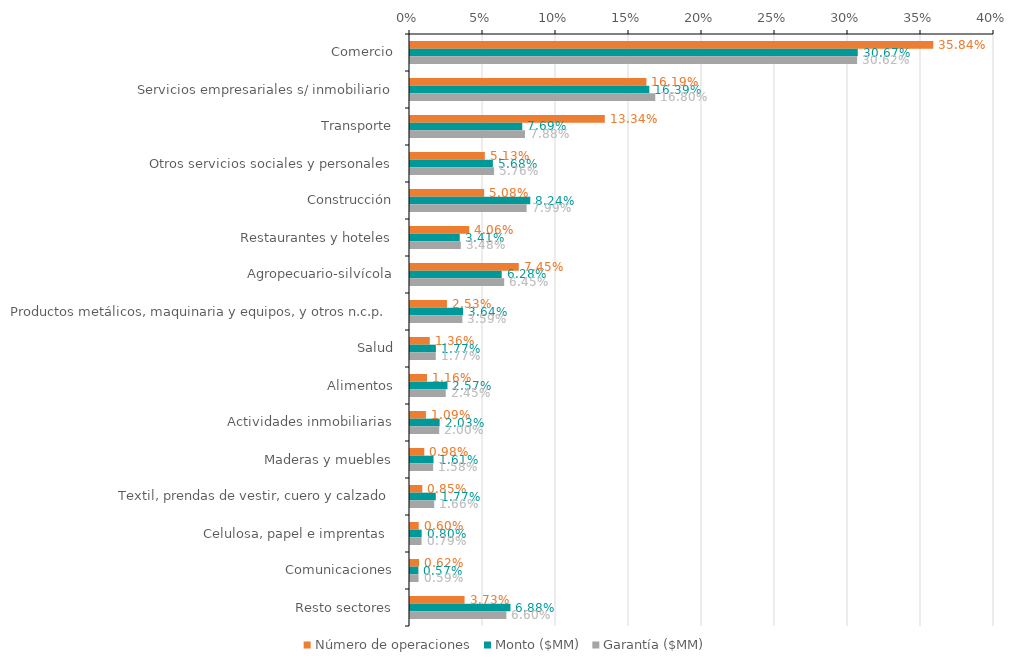
| Category | Número de operaciones | Monto ($MM) | Garantía ($MM) |
|---|---|---|---|
| Comercio | 0.358 | 0.307 | 0.306 |
| Servicios empresariales s/ inmobiliario | 0.162 | 0.164 | 0.168 |
| Transporte | 0.133 | 0.077 | 0.079 |
| Otros servicios sociales y personales | 0.051 | 0.057 | 0.058 |
| Construcción | 0.051 | 0.082 | 0.08 |
| Restaurantes y hoteles | 0.041 | 0.034 | 0.035 |
| Agropecuario-silvícola | 0.075 | 0.063 | 0.065 |
| Productos metálicos, maquinaria y equipos, y otros n.c.p. | 0.025 | 0.036 | 0.036 |
| Salud | 0.014 | 0.018 | 0.018 |
| Alimentos | 0.012 | 0.026 | 0.024 |
| Actividades inmobiliarias | 0.011 | 0.02 | 0.02 |
| Maderas y muebles | 0.01 | 0.016 | 0.016 |
| Textil, prendas de vestir, cuero y calzado | 0.008 | 0.018 | 0.017 |
| Celulosa, papel e imprentas  | 0.006 | 0.008 | 0.008 |
| Comunicaciones | 0.006 | 0.006 | 0.006 |
| Resto sectores | 0.037 | 0.069 | 0.066 |